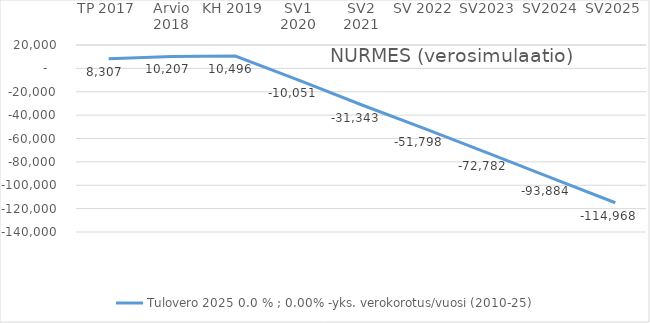
| Category | Tulovero 2025 |
|---|---|
| TP 2017 | 8307 |
| Arvio 2018 | 10206.818 |
| KH 2019 | 10496.253 |
| SV1 2020 | -10050.611 |
| SV2 2021 | -31343.452 |
| SV 2022 | -51797.987 |
| SV2023 | -72781.878 |
| SV2024 | -93883.613 |
| SV2025 | -114967.704 |